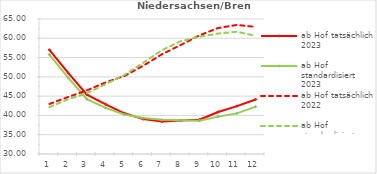
| Category | ab Hof tatsächlich 2023 | ab Hof standardisiert 2023 | ab Hof tatsächlich 2022 | ab Hof standardisiert 2022 |
|---|---|---|---|---|
| 0 | 57.003 | 55.795 | 42.973 | 42.18 |
| 1 | 51.009 | 49.794 | 44.778 | 44.176 |
| 2 | 45.377 | 44.195 | 46.5 | 45.781 |
| 3 | 42.871 | 41.963 | 48.562 | 48.095 |
| 4 | 40.55 | 40.226 | 50.218 | 50.481 |
| 5 | 39.042 | 39.339 | 52.879 | 53.655 |
| 6 | 38.434 | 38.855 | 55.852 | 56.913 |
| 7 | 38.707 | 38.736 | 58.254 | 59.229 |
| 8 | 38.896 | 38.629 | 60.74 | 60.406 |
| 9 | 40.899 | 39.695 | 62.671 | 61.229 |
| 10 | 42.41 | 40.532 | 63.46 | 61.708 |
| 11 | 44.14 | 42.272 | 62.949 | 60.649 |